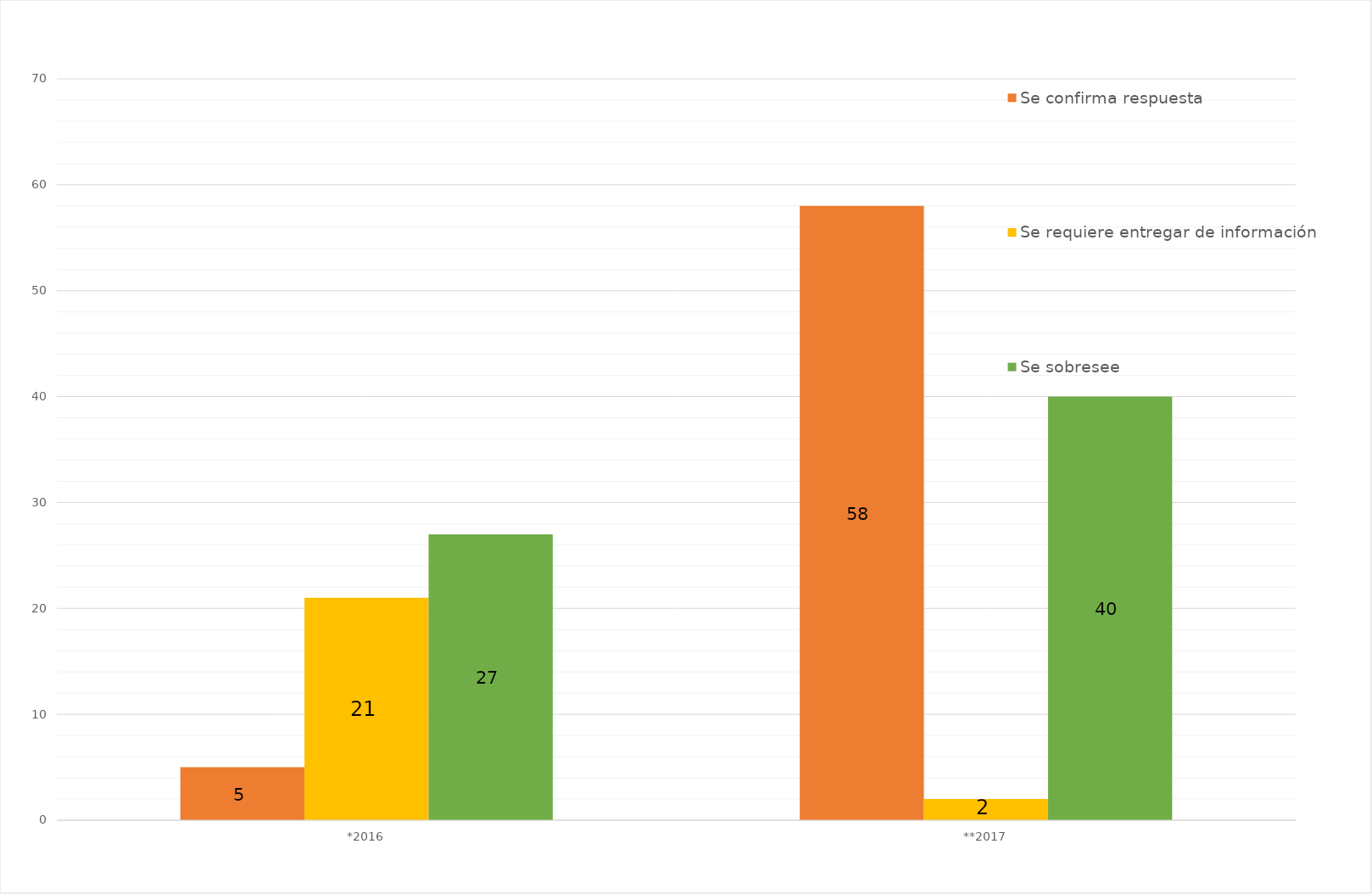
| Category | Se confirma respuesta | Se requiere entregar de información  | Se sobresee  |
|---|---|---|---|
| *2016 | 5 | 21 | 27 |
| **2017 | 58 | 2 | 40 |